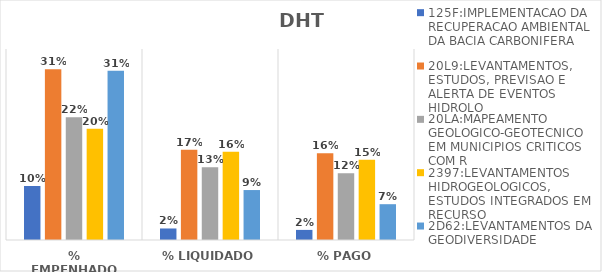
| Category | 125F:IMPLEMENTACAO DA RECUPERACAO AMBIENTAL DA BACIA CARBONIFERA | 20L9:LEVANTAMENTOS, ESTUDOS, PREVISAO E ALERTA DE EVENTOS HIDROLO | 20LA:MAPEAMENTO GEOLOGICO-GEOTECNICO EM MUNICIPIOS CRITICOS COM R | 2397:LEVANTAMENTOS HIDROGEOLOGICOS, ESTUDOS INTEGRADOS EM RECURSO | 2D62:LEVANTAMENTOS DA GEODIVERSIDADE |
|---|---|---|---|---|---|
| % EMPENHADO | 0.099 | 0.313 | 0.225 | 0.204 | 0.31 |
| % LIQUIDADO | 0.021 | 0.166 | 0.133 | 0.162 | 0.092 |
| % PAGO | 0.019 | 0.159 | 0.122 | 0.147 | 0.066 |